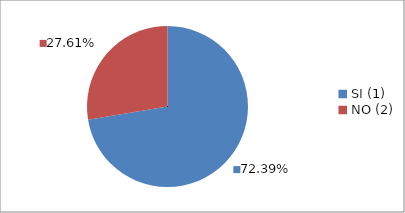
| Category | Series 0 |
|---|---|
| SI (1) | 0.724 |
| NO (2) | 0.276 |